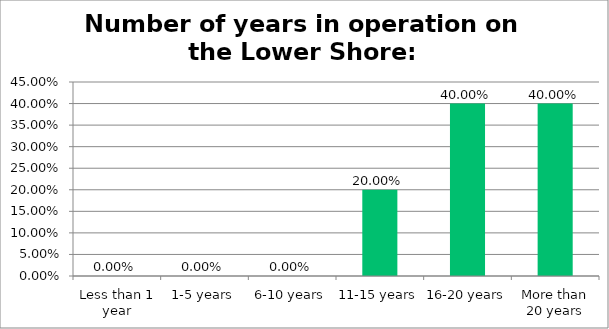
| Category | Responses |
|---|---|
| Less than 1 year | 0 |
| 1-5 years | 0 |
| 6-10 years | 0 |
| 11-15 years | 0.2 |
| 16-20 years | 0.4 |
| More than 20 years | 0.4 |